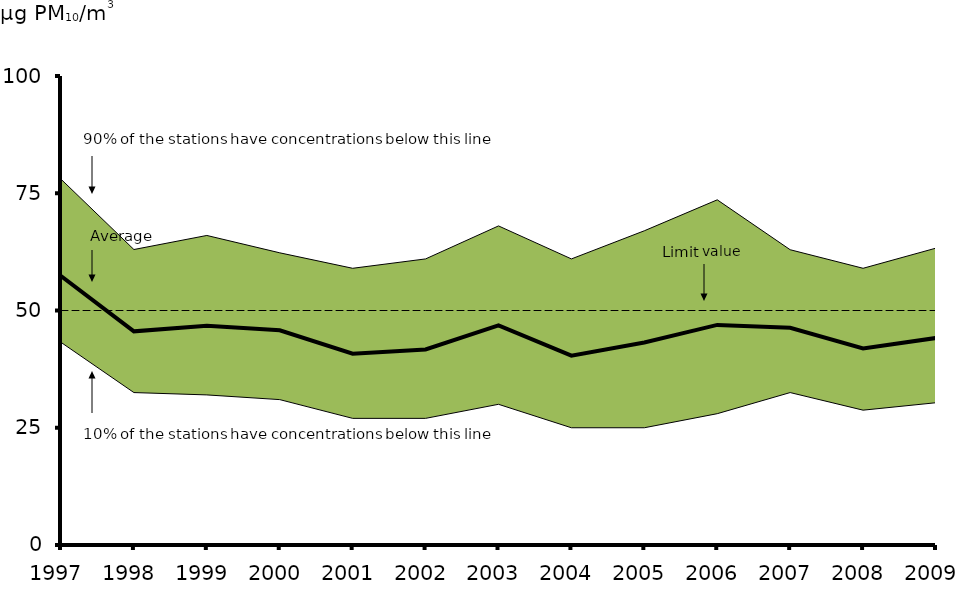
| Category | Average | Limit value |
|---|---|---|
| 1997.0 | 57.354 | 50 |
| 1998.0 | 45.551 | 50 |
| 1999.0 | 46.731 | 50 |
| 2000.0 | 45.777 | 50 |
| 2001.0 | 40.791 | 50 |
| 2002.0 | 41.683 | 50 |
| 2003.0 | 46.843 | 50 |
| 2004.0 | 40.369 | 50 |
| 2005.0 | 43.18 | 50 |
| 2006.0 | 46.929 | 50 |
| 2007.0 | 46.327 | 50 |
| 2008.0 | 41.92 | 50 |
| 2009.0 | 44.141 | 50 |